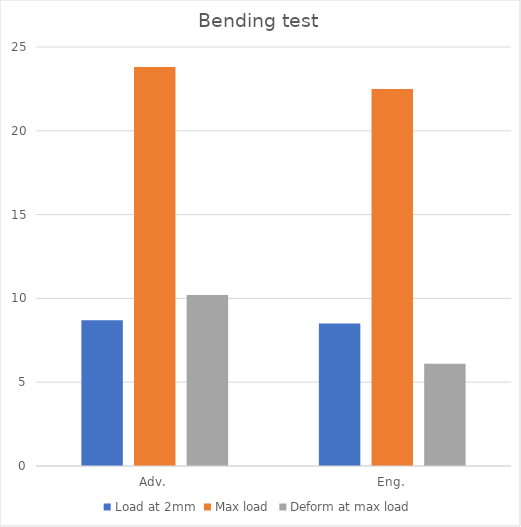
| Category | Load at 2mm | Max load | Deform at max load |
|---|---|---|---|
| Adv. | 8.7 | 23.8 | 10.2 |
| Eng. | 8.5 | 22.5 | 6.1 |